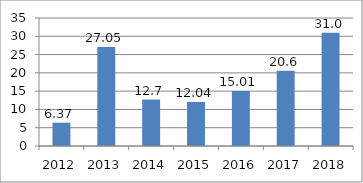
| Category | Series 0 |
|---|---|
| 2012.0 | 6.37 |
| 2013.0 | 27.05 |
| 2014.0 | 12.7 |
| 2015.0 | 12.04 |
| 2016.0 | 15.01 |
| 2017.0 | 20.6 |
| 2018.0 | 31 |